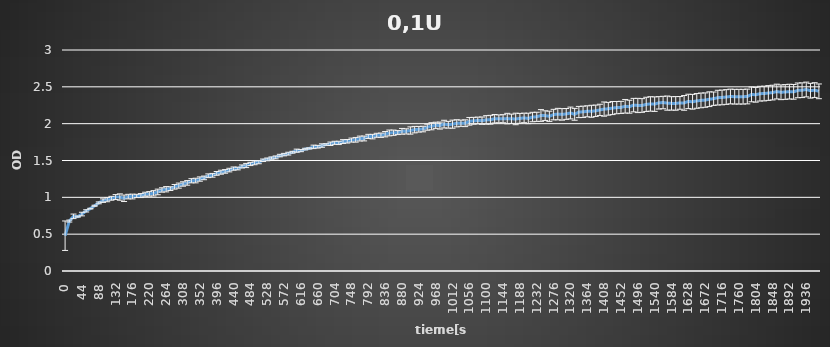
| Category | 0,1U |
|---|---|
| 0.0 | 0.479 |
| 11.0 | 0.678 |
| 22.0 | 0.742 |
| 33.0 | 0.738 |
| 44.0 | 0.773 |
| 55.0 | 0.816 |
| 66.0 | 0.847 |
| 77.0 | 0.886 |
| 88.0 | 0.925 |
| 99.0 | 0.955 |
| 110.0 | 0.969 |
| 121.0 | 0.987 |
| 132.0 | 1.004 |
| 143.0 | 1.004 |
| 154.0 | 0.987 |
| 165.0 | 1.01 |
| 176.0 | 1.011 |
| 187.0 | 1.019 |
| 198.0 | 1.024 |
| 209.0 | 1.042 |
| 220.0 | 1.047 |
| 231.0 | 1.055 |
| 242.0 | 1.073 |
| 253.0 | 1.1 |
| 264.0 | 1.11 |
| 275.0 | 1.118 |
| 286.0 | 1.143 |
| 297.0 | 1.159 |
| 308.0 | 1.181 |
| 319.0 | 1.196 |
| 330.0 | 1.225 |
| 341.0 | 1.228 |
| 352.0 | 1.248 |
| 363.0 | 1.264 |
| 374.0 | 1.293 |
| 385.0 | 1.299 |
| 396.0 | 1.325 |
| 407.0 | 1.341 |
| 418.0 | 1.352 |
| 429.0 | 1.37 |
| 440.0 | 1.39 |
| 451.0 | 1.391 |
| 462.0 | 1.419 |
| 473.0 | 1.432 |
| 484.0 | 1.453 |
| 495.0 | 1.468 |
| 506.0 | 1.477 |
| 517.0 | 1.503 |
| 528.0 | 1.515 |
| 539.0 | 1.533 |
| 550.0 | 1.542 |
| 561.0 | 1.567 |
| 572.0 | 1.58 |
| 583.0 | 1.593 |
| 594.0 | 1.612 |
| 605.0 | 1.633 |
| 616.0 | 1.634 |
| 627.0 | 1.655 |
| 638.0 | 1.664 |
| 649.0 | 1.685 |
| 660.0 | 1.687 |
| 671.0 | 1.703 |
| 682.0 | 1.717 |
| 693.0 | 1.727 |
| 704.0 | 1.74 |
| 715.0 | 1.739 |
| 726.0 | 1.757 |
| 737.0 | 1.761 |
| 748.0 | 1.777 |
| 759.0 | 1.781 |
| 770.0 | 1.798 |
| 781.0 | 1.799 |
| 792.0 | 1.827 |
| 803.0 | 1.824 |
| 814.0 | 1.842 |
| 825.0 | 1.843 |
| 836.0 | 1.857 |
| 847.0 | 1.874 |
| 858.0 | 1.877 |
| 869.0 | 1.879 |
| 880.0 | 1.896 |
| 891.0 | 1.895 |
| 902.0 | 1.907 |
| 913.0 | 1.919 |
| 924.0 | 1.924 |
| 935.0 | 1.927 |
| 946.0 | 1.952 |
| 957.0 | 1.965 |
| 968.0 | 1.978 |
| 979.0 | 1.974 |
| 990.0 | 1.994 |
| 1001.0 | 1.985 |
| 1012.0 | 1.993 |
| 1023.0 | 2.005 |
| 1034.0 | 2.006 |
| 1045.0 | 2.006 |
| 1056.0 | 2.032 |
| 1067.0 | 2.039 |
| 1078.0 | 2.043 |
| 1089.0 | 2.041 |
| 1100.0 | 2.051 |
| 1111.0 | 2.053 |
| 1122.0 | 2.067 |
| 1133.0 | 2.065 |
| 1144.0 | 2.067 |
| 1155.0 | 2.069 |
| 1166.0 | 2.066 |
| 1177.0 | 2.064 |
| 1188.0 | 2.072 |
| 1199.0 | 2.078 |
| 1210.0 | 2.071 |
| 1221.0 | 2.09 |
| 1232.0 | 2.093 |
| 1243.0 | 2.111 |
| 1254.0 | 2.109 |
| 1265.0 | 2.1 |
| 1276.0 | 2.123 |
| 1287.0 | 2.13 |
| 1298.0 | 2.126 |
| 1309.0 | 2.132 |
| 1320.0 | 2.145 |
| 1331.0 | 2.127 |
| 1342.0 | 2.158 |
| 1353.0 | 2.161 |
| 1364.0 | 2.168 |
| 1375.0 | 2.168 |
| 1386.0 | 2.175 |
| 1397.0 | 2.187 |
| 1408.0 | 2.198 |
| 1419.0 | 2.202 |
| 1430.0 | 2.212 |
| 1441.0 | 2.218 |
| 1452.0 | 2.221 |
| 1463.0 | 2.236 |
| 1474.0 | 2.23 |
| 1485.0 | 2.252 |
| 1496.0 | 2.247 |
| 1507.0 | 2.247 |
| 1518.0 | 2.262 |
| 1529.0 | 2.268 |
| 1540.0 | 2.265 |
| 1551.0 | 2.283 |
| 1562.0 | 2.287 |
| 1573.0 | 2.279 |
| 1584.0 | 2.275 |
| 1595.0 | 2.275 |
| 1606.0 | 2.282 |
| 1617.0 | 2.282 |
| 1628.0 | 2.302 |
| 1639.0 | 2.297 |
| 1650.0 | 2.309 |
| 1661.0 | 2.316 |
| 1672.0 | 2.32 |
| 1683.0 | 2.332 |
| 1694.0 | 2.339 |
| 1705.0 | 2.353 |
| 1716.0 | 2.356 |
| 1727.0 | 2.362 |
| 1738.0 | 2.369 |
| 1749.0 | 2.366 |
| 1760.0 | 2.366 |
| 1771.0 | 2.366 |
| 1782.0 | 2.369 |
| 1793.0 | 2.397 |
| 1804.0 | 2.392 |
| 1815.0 | 2.407 |
| 1826.0 | 2.409 |
| 1837.0 | 2.416 |
| 1848.0 | 2.422 |
| 1859.0 | 2.436 |
| 1870.0 | 2.426 |
| 1881.0 | 2.43 |
| 1892.0 | 2.435 |
| 1903.0 | 2.432 |
| 1914.0 | 2.452 |
| 1925.0 | 2.454 |
| 1936.0 | 2.464 |
| 1947.0 | 2.447 |
| 1958.0 | 2.456 |
| 1969.0 | 2.439 |